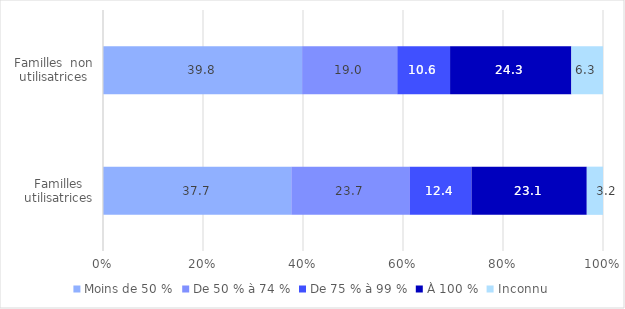
| Category | Moins de 50 % | De 50 % à 74 % | De 75 % à 99 % | À 100 % | Inconnu |
|---|---|---|---|---|---|
| Familles utilisatrices | 37.66 | 23.655 | 12.383 | 23.057 | 3.245 |
| Familles  non utilisatrices | 39.826 | 19.027 | 10.562 | 24.256 | 6.33 |